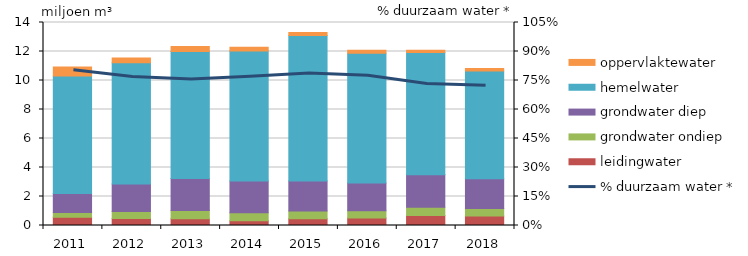
| Category | leidingwater | grondwater ondiep | grondwater diep | hemelwater | oppervlaktewater |
|---|---|---|---|---|---|
| 2011.0 | 566569.748 | 334859.947 | 1298603.208 | 8103912.711 | 620992.477 |
| 2012.0 | 477401.42 | 487171.177 | 1889273.59 | 8371912.755 | 322373.091 |
| 2013.0 | 458762.053 | 569559.746 | 2208780.48 | 8764469.801 | 349233.949 |
| 2014.0 | 325861.944 | 561982.382 | 2179395.092 | 8966642.038 | 251974.855 |
| 2015.0 | 471330.671 | 534000.928 | 2070881.65 | 10024295.373 | 216506.857 |
| 2016.0 | 511732.322 | 497075.209 | 1927681.906 | 8950167.618 | 196800 |
| 2017.0 | 688644.702 | 577406.597 | 2239210.95 | 8432116.479 | 145200 |
| 2018.0 | 647399.111 | 527911.841 | 2047267.871 | 7426361.79 | 181500 |